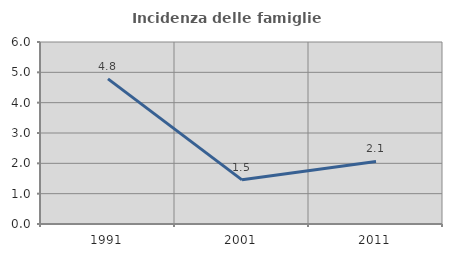
| Category | Incidenza delle famiglie numerose |
|---|---|
| 1991.0 | 4.785 |
| 2001.0 | 1.456 |
| 2011.0 | 2.062 |